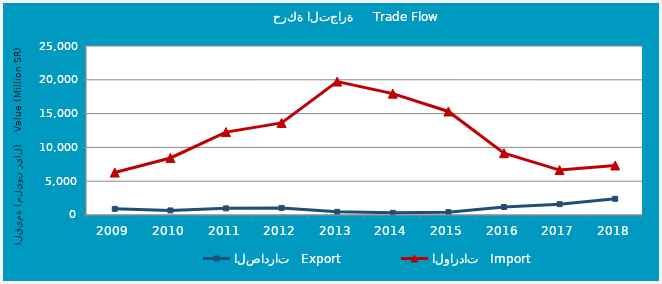
| Category | الصادرات   Export | الواردات   Import |
|---|---|---|
| 2009.0 | 908083902 | 6283353783 |
| 2010.0 | 675342787 | 8437497461 |
| 2011.0 | 982486532 | 12263537558 |
| 2012.0 | 1046805541 | 13620325970 |
| 2013.0 | 467488414 | 19739585467 |
| 2014.0 | 332025650 | 17952876578 |
| 2015.0 | 423830081 | 15316076450 |
| 2016.0 | 1181915519 | 9144531694 |
| 2017.0 | 1605620620 | 6643713068 |
| 2018.0 | 2398921967 | 7329262169 |